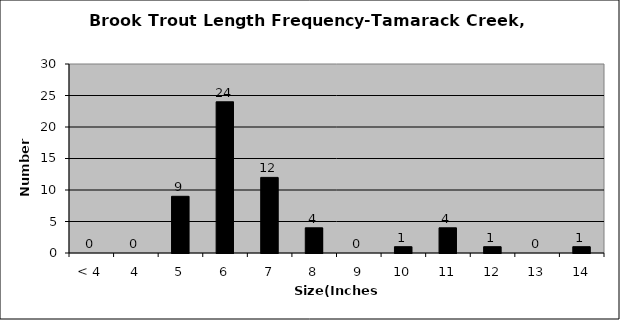
| Category | Series 0 |
|---|---|
| < 4 | 0 |
| 4 | 0 |
| 5 | 9 |
| 6 | 24 |
| 7 | 12 |
| 8 | 4 |
| 9 | 0 |
| 10 | 1 |
| 11 | 4 |
| 12 | 1 |
| 13 | 0 |
| 14 | 1 |